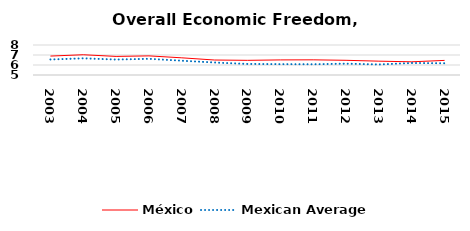
| Category | México | Mexican Average  |
|---|---|---|
| 2003.0 | 6.893 | 6.552 |
| 2004.0 | 7.025 | 6.668 |
| 2005.0 | 6.858 | 6.546 |
| 2006.0 | 6.912 | 6.619 |
| 2007.0 | 6.718 | 6.428 |
| 2008.0 | 6.498 | 6.248 |
| 2009.0 | 6.466 | 6.106 |
| 2010.0 | 6.509 | 6.086 |
| 2011.0 | 6.517 | 6.074 |
| 2012.0 | 6.469 | 6.134 |
| 2013.0 | 6.384 | 6.054 |
| 2014.0 | 6.319 | 6.2 |
| 2015.0 | 6.46 | 6.174 |